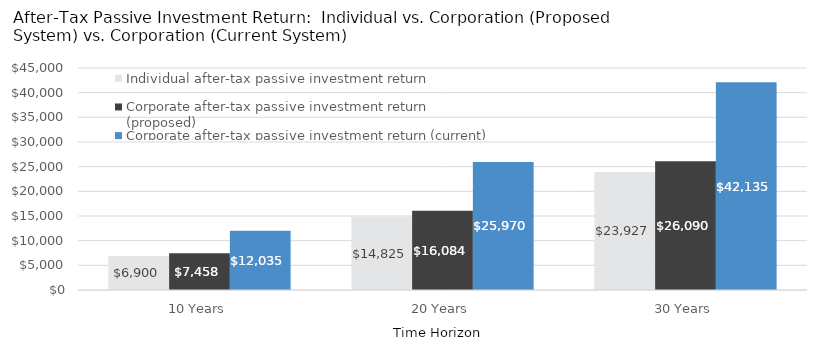
| Category | Individual after-tax passive investment return | Corporate after-tax passive investment return (proposed) | Corporate after-tax passive investment return (current) |
|---|---|---|---|
| 10 Years | 6900.285 | 7457.566 | 12034.735 |
| 20 Years | 14825.186 | 16083.702 | 25970.195 |
| 30 Years | 23926.848 | 26089.656 | 42134.741 |